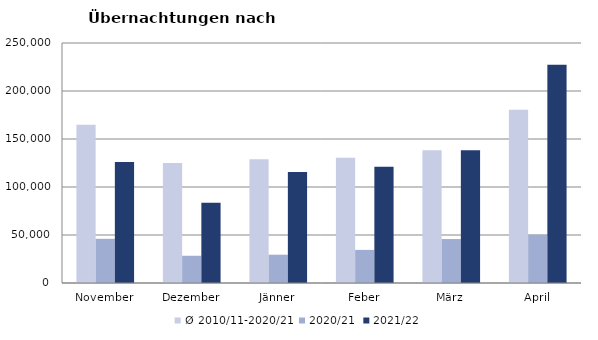
| Category | Ø 2010/11-2020/21 | 2020/21 | 2021/22 |
|---|---|---|---|
| November | 164966.545 | 46036 | 126150 |
| Dezember | 124993.364 | 28378 | 83661 |
| Jänner | 128876.636 | 29476 | 115620 |
| Feber | 130386.364 | 34472 | 121086 |
| März | 138154.364 | 45792 | 138364 |
| April | 180434.727 | 50285 | 227240 |